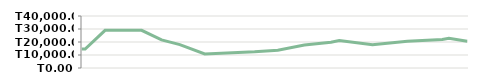
| Category | АЙ 2 |
|---|---|
| 2013-04-23 | 14600 |
| 2013-04-25 | 14600 |
| 2013-05-07 | 29000 |
| 2013-05-14 | 29000 |
| 2013-05-14 | 29000 |
| 2013-05-29 | 29000 |
| 2013-06-10 | 21600 |
| 2013-06-21 | 17950 |
| 2013-07-06 | 10776.471 |
| 2013-08-05 | 12455.862 |
| 2013-08-19 | 13667.568 |
| 2013-09-04 | 17651.667 |
| 2013-09-20 | 19877.912 |
| 2013-09-25 | 21138.05 |
| 2013-10-15 | 17951.744 |
| 2013-11-05 | 20556.13 |
| 2013-11-26 | 21997.139 |
| 2013-11-30 | 22917.635 |
| 2013-12-11 | 20504.315 |